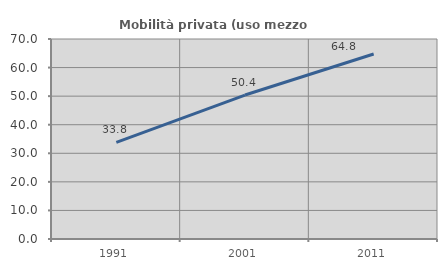
| Category | Mobilità privata (uso mezzo privato) |
|---|---|
| 1991.0 | 33.81 |
| 2001.0 | 50.385 |
| 2011.0 | 64.753 |